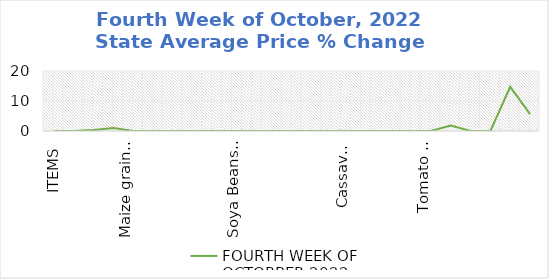
| Category | FOURTH WEEK OF OCTORBER 2022 |
|---|---|
| ITEMS | 0 |
| Rice, Imported, High Quality Sold loose  (1 mudu) | 0 |
| Rice, Agric Sold Loose(Low quality) imported  (1 mudu) | 0.369 |
| Rice Local, Sold Loose   (1 mudu) | 1.023 |
| Maize grain, white sold loose   (1 mudu) | 0 |
| Maize grain, yellow sold loose   (1 mudu) | 0 |
| Sorghum (Guinea Corn) white or brown, sold loose   (1 mudu) | 0 |
| millet (jero or maiwa) sold loose   (1 mudu) | 0 |
| Beans: white black eye. Sold loose   (1 mudu) | 0 |
| Beans Brown, sold loose  (1 mudu) | 0 |
| Soya Beans, sold loose    (1 mudu) | 0 |
| Gari White, sold loose  (1 mudu) | 0 |
| Gari Yellow, sold loose   (1 mudu) | 0 |
| Palm oil (1 schnap bottle) | 0 |
| Yam tuber (1 Medium Size) | 0 |
| Cassava tuber | 0 |
| Irish potato  (4 Litre rubber) | 0 |
| Sweet potato  (5 Medium Size) | 0 |
| Local live chicken  | 0 |
| Groundnut - shelled (fresh) | 0 |
| Tomato fresh   (4 Litre rubber) | 1.84 |
| Okro fresh     (1 mudu) | 0 |
| Okro dried    (1 mudu) | 0 |
| Onion   (4 Litre rubber) | 14.727 |
| Pepper fresh   (4 Litre rubber) | 5.627 |